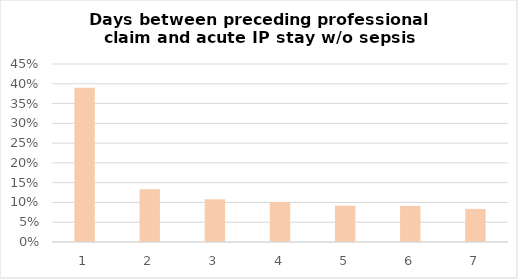
| Category | Number of days between preceeding professional claim and Acute IP admission |
|---|---|
| 1.0 | 0.39 |
| 2.0 | 0.134 |
| 3.0 | 0.108 |
| 4.0 | 0.101 |
| 5.0 | 0.092 |
| 6.0 | 0.091 |
| 7.0 | 0.084 |